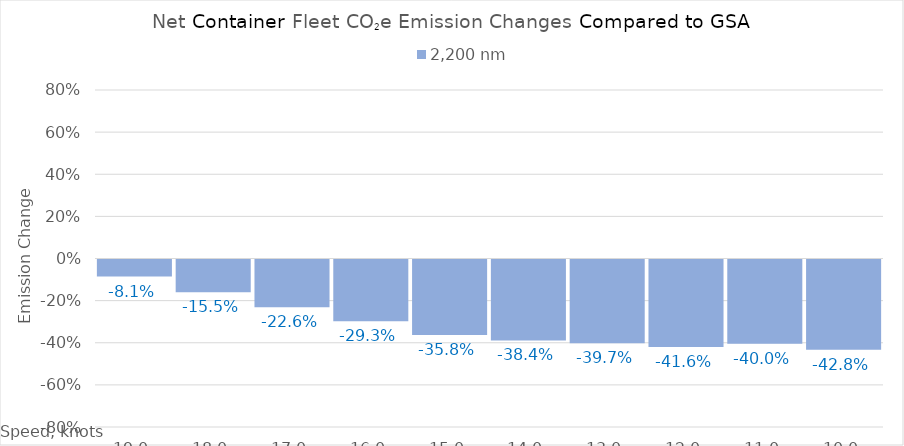
| Category | 2,200 |
|---|---|
| 19.0 | -0.081 |
| 18.0 | -0.155 |
| 17.0 | -0.226 |
| 16.0 | -0.293 |
| 15.0 | -0.358 |
| 14.0 | -0.384 |
| 13.0 | -0.397 |
| 12.0 | -0.416 |
| 11.0 | -0.4 |
| 10.0 | -0.428 |